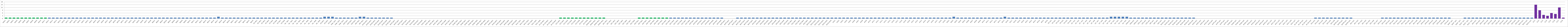
| Category | Series 0 |
|---|---|
| AW01 | 1 |
| AW02 | 1 |
| AW03 | 1 |
| AW04 | 1 |
| AW05 | 1 |
| AW06 | 1 |
| AW07 | 1 |
| AW08 | 1 |
| AW09 | 1 |
| AW10 | 1 |
| AW11 | 1 |
| AW12 | 1 |
| AW13 | 1 |
| AW14 | 1 |
| AW15 | 1 |
| AW16 | 1 |
| AW17 | 1 |
| AW18 | 1 |
| AW19 | 1 |
| AW20 | 1 |
| AW21 | 1 |
| AW22 | 1 |
| AW23 | 1 |
| AW24 | 1 |
| AW25 | 1 |
| AW26 | 1 |
| AW27 | 1 |
| AW28 | 1 |
| AW29 | 1 |
| AW30 | 1 |
| AW31 | 1 |
| AW32 | 1 |
| AW33 | 1 |
| AW34 | 1 |
| AW35 | 1 |
| AW36 | 1 |
| AW37 | 1 |
| AW38 | 1 |
| BW01 | 1 |
| BW02 | 1 |
| BW03 | 1 |
| BWO4 | 1 |
| BW05 | 1 |
| BW06 | 1 |
| BW07 | 1 |
| BW08 | 1 |
| BW09 | 1 |
| BW10 | 1 |
| BW11 | 1 |
| BW12 | 1 |
| BW13 | 1 |
| BW14 | 1 |
| BW15 | 1 |
| BW16 | 1 |
| BW17 | 2 |
| BW18 | 1 |
| BW19 | 1 |
| BW20 | 1 |
| BW21 | 1 |
| BW22 | 1 |
| BW23 | 1 |
| BW24 | 1 |
| BW25 | 1 |
| BW26 | 1 |
| OS.W01 | 1 |
| OS.W02 | 1 |
| OS.W03 | 1 |
| OS.W04 | 1 |
| OS.W05 | 1 |
| OS.W06 | 1 |
| OS.W07 | 1 |
| OS.W08 | 1 |
| OE. W01 | 1 |
| OE. W02 | 1 |
| OE. W03 | 1 |
| OE. W04 | 1 |
| OE. W05 | 1 |
| OE. W06 | 1 |
| OE. W07 | 1 |
| OE. W08 | 1 |
| OE. W09 | 1 |
| OA.W01 | 2 |
| OA.W02 | 2 |
| OA.W03 | 2 |
| OAN. W01 | 1 |
| OAN. W02 | 1 |
| OAN. W03 | 1 |
| OZŚ.W01 | 1 |
| OZŚ.W02 | 1 |
| OZŚ.W03 | 1 |
| OPE.W01 | 2 |
| OPE.W02 | 2 |
| B1OD.W01 | 1 |
| B1OD.W02 | 1 |
| B1OD.W03 | 1 |
| B1OD.W04 | 1 |
| B1OD.W05 | 1 |
| B1OD.W06 | 1 |
| B1OD.W07 | 1 |
| B1PZ.W01 | 0 |
| B1PZ.W02 | 0 |
| B1PZ.W03 | 0 |
| B1PZ.W04 | 0 |
| B1PZ.W05 | 0 |
| B1PZ.W06 | 0 |
| B1PZ.W07 | 0 |
| B1PZ.W08 | 0 |
| B1PS.W01 | 0 |
| B1PS.W02 | 0 |
| B1PS.W03 | 0 |
| B1PS.W04 | 0 |
| B1PS.W05 | 0 |
| B1PS.W06 | 0 |
| B1PS.W07 | 0 |
| B1PS.W08 | 0 |
| B1MŚ.W01 | 0 |
| B1MŚ.W02 | 0 |
| B1MŚ.W03 | 0 |
| B1MŚ.W04 | 0 |
| B1MŚ.W05 | 0 |
| B1MŚ.W06 | 0 |
| B1MŚ.W07 | 0 |
| B1MŚ.W08 | 0 |
| B1PO.W01 | 0 |
| B1PO.W02 | 0 |
| B1PO.W03 | 0 |
| B1PO.W04 | 0 |
| B1PO.W05 | 0 |
| B1PO.W06 | 0 |
| B1PO.W07 | 0 |
| B1PO.W08 | 0 |
| B1EL.W01 | 0 |
| B1EL.W02 | 0 |
| B1EL.W03 | 0 |
| B1EL.W04 | 0 |
| B1EL.W05 | 0 |
| B1EL.W06 | 0 |
| B1.PR.W01 | 0 |
| B1.PR.W02 | 0 |
| B1.PR.W03 | 0 |
| B1.PR.W04 | 0 |
| B1S.W01 | 1 |
| B1S.W02 | 1 |
| B1S.W03 | 1 |
| B1S.W04 | 1 |
| B1S.W05 | 1 |
| B1S.W06 | 1 |
| B1S.W07 | 1 |
| B1S.W08 | 1 |
| B2PW.W01 | 1 |
| B2PW.W02 | 1 |
| B2PW.W03 | 1 |
| B2PW.W04 | 1 |
| B2C.W01 | 0 |
| B2C.W02 | 0 |
| B2C.W03 | 0 |
| B2C.W04 | 0 |
| B2C.W05 | 0 |
| B2C.W06 | 0 |
| B2C.W07 | 0 |
| B2C.W08 | 0 |
| B2K.W01 | 1 |
| B2K.W02 | 1 |
| B2K.W03 | 1 |
| B2K.W04 | 1 |
| B2K.W05 | 1 |
| B2K.W06 | 1 |
| B2U.W01 | 1 |
| B2U.W02 | 1 |
| B2U.W03 | 1 |
| B2U.W04 | 1 |
| B2U.W05 | 1 |
| B2U.W06 | 1 |
| B2U.W07 | 1 |
| B2U.W08 | 1 |
| B2N.W01 | 1 |
| B2N.W02 | 1 |
| B2N.W03 | 1 |
| B2N.W04 | 1 |
| B2N.W05 | 1 |
| B2N.W06 | 1 |
| B2N.W07 | 1 |
| B2N.W08 | 1 |
| B2PP.W01 | 0 |
| B2PP.W02 | 0 |
| B2PP.W03 | 0 |
| B2ŻY.W01 | 1 |
| B2ŻY.W02 | 1 |
| B2ŻY.W03 | 1 |
| B2ŻY.W04 | 1 |
| B2ŻY.W05 | 1 |
| B2O.W01 | 1 |
| B2O.W02 | 1 |
| B2O.W03 | 1 |
| B2O.W04 | 1 |
| B2O.W05 | 1 |
| B2O.W06 | 1 |
| B2O.W07 | 1 |
| B2O.W08 | 1 |
| B2O.W09 | 1 |
| B2D.W01 | 1 |
| B2D.W02 | 1 |
| B2D.W03 | 1 |
| B2D.W04 | 1 |
| B2D.W05 | 1 |
| B2CH.W01 | 1 |
| B2CH.W02 | 1 |
| B2CH.W03 | 1 |
| B2CH.W04 | 1 |
| B2CH.W05 | 1 |
| B2CH.W06 | 1 |
| AU01 | 1 |
| AU02 | 1 |
| AU03 | 1 |
| AU04 | 1 |
| AU05 | 1 |
| AU06 | 1 |
| AU07 | 1 |
| AU08 | 1 |
| AU09 | 1 |
| AU10 | 1 |
| AU11 | 1 |
| AU12 | 1 |
| AU13 | 1 |
| AU14 | 1 |
| AU15 | 1 |
| AU16 | 1 |
| AU17 | 1 |
| AU18 | 1 |
| AU19 | 1 |
| AU20 | 1 |
| AU21 | 1 |
| AU22 | 1 |
| AU23 | 1 |
| AU24 | 1 |
| AU25 | 1 |
| AU26 | 1 |
| AU27 | 1 |
| AU28 | 1 |
| AU29 | 1 |
| BU01 | 1 |
| BU02 | 2 |
| BU03 | 1 |
| BU04 | 1 |
| BU05 | 1 |
| BU06 | 1 |
| BU07 | 1 |
| BU08 | 1 |
| BU09 | 1 |
| BU10 | 1 |
| BU11 | 1 |
| BU12 | 1 |
| BU13 | 1 |
| BU14 | 1 |
| BU15 | 2 |
| BU16 | 1 |
| BU17 | 1 |
| BU18 | 1 |
| BU19 | 1 |
| BU20 | 1 |
| BU21 | 1 |
| BU22 | 1 |
| BU23 | 1 |
| BU24 | 1 |
| BU25 | 1 |
| BU26 | 1 |
| OS.U01 | 1 |
| OS.U02 | 1 |
| OS.U03 | 1 |
| OS.U04 | 1 |
| OS.U05 | 1 |
| OS.U06 | 1 |
| OE. U01 | 1 |
| OE. U02 | 1 |
| OE. U03 | 1 |
| OE. U04 | 1 |
| OE. U05 | 1 |
| OE. U06 | 1 |
| OE. U07 | 1 |
| OE. U08 | 1 |
| OE. U09 | 1 |
| OA. U01 | 2 |
| OA. U02 | 2 |
| OA. U03 | 2 |
| OA. U04 | 2 |
| OA. U05 | 2 |
| OAN.U01 | 1 |
| OAN.U02 | 1 |
| OAN.U03 | 1 |
| OZŚ.U01 | 1 |
| OZŚ.U02 | 1 |
| OZŚ.U03 | 1 |
| OPE.U01 | 1 |
| OPE.U02 | 1 |
| OPE.U03 | 1 |
| B1OD.U01 | 1 |
| B1OD.U02 | 1 |
| B1OD.U03 | 1 |
| B1OD.U04 | 1 |
| B1OD.U05 | 1 |
| B1OD.U06 | 1 |
| B1OD.U07 | 1 |
| B1OD.U08 | 1 |
| B1PZ.U01 | 0 |
| B1PZ.U02 | 0 |
| B1PZ.U03 | 0 |
| B1PZ.U04 | 0 |
| B1PZ.U05 | 0 |
| B1PS.U01 | 0 |
| B1PS.U02 | 0 |
| B1PS.U03 | 0 |
| B1PS.U04 | 0 |
| B1MŚ.U01 | 0 |
| B1MŚ.U02 | 0 |
| B1MŚ.U03 | 0 |
| B1MŚ.U04 | 0 |
| B1MŚ.U05 | 0 |
| B1PO.U01 | 0 |
| B1PO.U02 | 0 |
| B1PO.U03 | 0 |
| B1PO.U04 | 0 |
| B1PO.U05 | 0 |
| B1EL.U01 | 0 |
| B1EL.U02 | 0 |
| B1EL.U03 | 0 |
| B1EL.U04 | 0 |
| B1EL.U05 | 0 |
| B1EL.U06 | 0 |
| B1EL.U07 | 0 |
| B1.RP.U01 | 0 |
| B1.RP.U02 | 0 |
| B1.RP.U03 | 0 |
| B1.RP.U04 | 0 |
| B2S.U01 | 1 |
| B2S.U02 | 1 |
| B2S.U03 | 1 |
| B2S.U04 | 1 |
| B2S.U05 | 1 |
| B2S.U06 | 1 |
| B2PW.U01 | 1 |
| B2PW.U02 | 1 |
| B2PW.U03 | 1 |
| B2PW.U04 | 1 |
| B2C.U01 | 0 |
| B2C.U02 | 0 |
| B2C.U03 | 0 |
| B2C.U04 | 0 |
| B2C.U05 | 0 |
| B2C.U06 | 0 |
| B2C.U07 | 0 |
| B2K.U01 | 1 |
| B2K.U02 | 1 |
| B2K.U03 | 1 |
| B2K.U04 | 1 |
| B2U.U01 | 1 |
| B2U.U02 | 1 |
| B2U.U03 | 1 |
| B2U.U04 | 1 |
| B2U.U05 | 1 |
| B2U.U06 | 1 |
| B2U.U07 | 1 |
| B2N.U01 | 1 |
| B2N.U02 | 1 |
| B2N.U03 | 1 |
| B2N.U04 | 1 |
| B2N.U05 | 1 |
| B2N.U06 | 1 |
| B2N.U07 | 1 |
| B2PP. U01 | 0 |
| B2PP. U02 | 0 |
| B2PP. U03 | 0 |
| B2ŻY. U01 | 1 |
| B2ŻY. U02 | 1 |
| B2ŻY. U03 | 1 |
| B2O.U01 | 1 |
| B2O.U02 | 1 |
| B2O.U03 | 1 |
| B2O.U04 | 1 |
| B2O.U05 | 1 |
| B2O.U06 | 1 |
| B2O.U07 | 1 |
| B2D.U01 | 1 |
| B2D.U02 | 1 |
| B2D.U03 | 1 |
| B2D.U04 | 1 |
| B2D.U05 | 1 |
| B2CH.U01 | 1 |
| B2CH.U02 | 1 |
| B2CH.U03 | 1 |
| B.K1 | 15 |
| B.K2 | 9 |
| B.K3 | 4 |
| B.K4 | 3 |
| B.K5 | 6 |
| B.K6 | 5 |
| B.K7 | 12 |
| B.K8 | 1 |